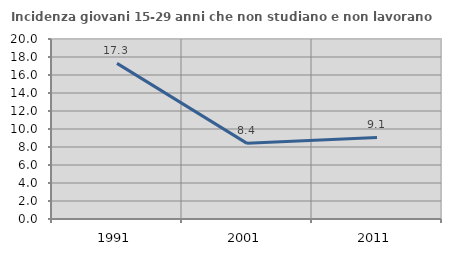
| Category | Incidenza giovani 15-29 anni che non studiano e non lavorano  |
|---|---|
| 1991.0 | 17.289 |
| 2001.0 | 8.405 |
| 2011.0 | 9.064 |